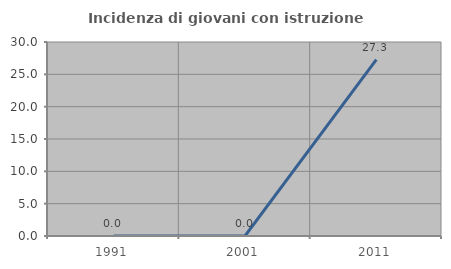
| Category | Incidenza di giovani con istruzione universitaria |
|---|---|
| 1991.0 | 0 |
| 2001.0 | 0 |
| 2011.0 | 27.273 |